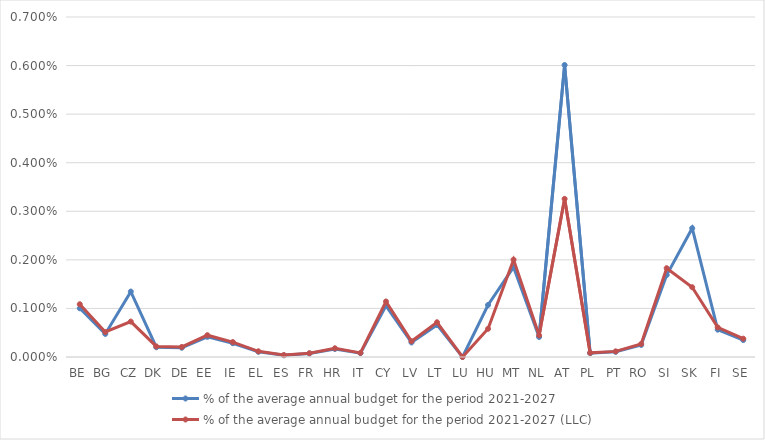
| Category | % of the average annual budget for the period 2021-2027 | % of the average annual budget for the period 2021-2027 (LLC) |
|---|---|---|
| BE | 0.001 | 0.001 |
| BG | 0 | 0.001 |
| CZ | 0.001 | 0.001 |
| DK | 0 | 0 |
| DE | 0 | 0 |
| EE | 0 | 0 |
| IE | 0 | 0 |
| EL | 0 | 0 |
| ES | 0 | 0 |
| FR | 0 | 0 |
| HR | 0 | 0 |
| IT | 0 | 0 |
| CY | 0.001 | 0.001 |
| LV | 0 | 0 |
| LT | 0.001 | 0.001 |
| LU | 0 | 0 |
| HU | 0.001 | 0.001 |
| MT | 0.002 | 0.002 |
| NL | 0 | 0 |
| AT | 0.006 | 0.003 |
| PL | 0 | 0 |
| PT | 0 | 0 |
| RO | 0 | 0 |
| SI | 0.002 | 0.002 |
| SK | 0.003 | 0.001 |
| FI | 0.001 | 0.001 |
| SE | 0 | 0 |